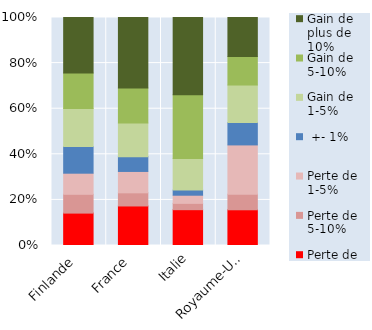
| Category | Perte de plus de 10% | Perte de 5-10% | Perte de 1-5% |  +- 1% | Gain de 1-5% | Gain de 5-10% | Gain de plus de 10% |
|---|---|---|---|---|---|---|---|
| Finlande | 14.21 | 8.24 | 9.26 | 11.66 | 16.72 | 15.55 | 24.36 |
| France  | 17.34 | 5.76 | 9.38 | 6.49 | 14.81 | 15.32 | 30.9 |
| Italie | 15.71 | 2.77 | 3.57 | 2.24 | 13.85 | 27.93 | 33.92 |
| Royaume-Uni | 15.67 | 6.83 | 21.62 | 9.82 | 16.45 | 12.46 | 17.16 |